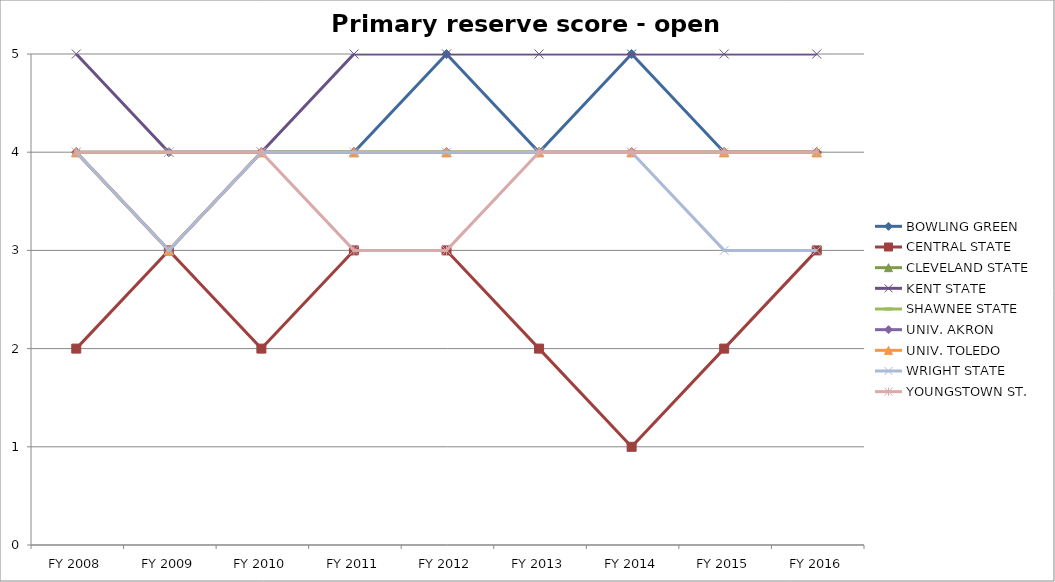
| Category | BOWLING GREEN  | CENTRAL STATE  | CLEVELAND STATE  | KENT STATE  | SHAWNEE STATE  | UNIV. AKRON  | UNIV. TOLEDO  | WRIGHT STATE  | YOUNGSTOWN ST.  |
|---|---|---|---|---|---|---|---|---|---|
| FY 2016 | 4 | 3 | 4 | 5 | 4 | 4 | 4 | 3 | 4 |
| FY 2015 | 4 | 2 | 4 | 5 | 4 | 4 | 4 | 3 | 4 |
| FY 2014 | 5 | 1 | 4 | 5 | 4 | 4 | 4 | 4 | 4 |
| FY 2013 | 4 | 2 | 4 | 5 | 4 | 4 | 4 | 4 | 4 |
| FY 2012 | 5 | 3 | 4 | 5 | 4 | 4 | 4 | 4 | 3 |
| FY 2011 | 4 | 3 | 4 | 5 | 4 | 4 | 4 | 4 | 3 |
| FY 2010 | 4 | 2 | 4 | 4 | 4 | 4 | 4 | 4 | 4 |
| FY 2009 | 4 | 3 | 3 | 4 | 4 | 3 | 3 | 3 | 4 |
| FY 2008 | 4 | 2 | 4 | 5 | 4 | 4 | 4 | 4 | 4 |